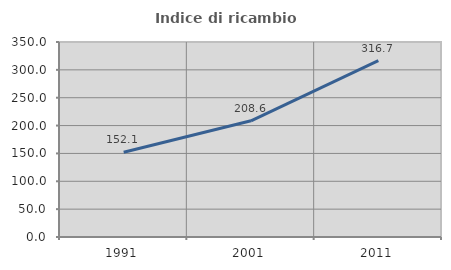
| Category | Indice di ricambio occupazionale  |
|---|---|
| 1991.0 | 152.091 |
| 2001.0 | 208.611 |
| 2011.0 | 316.667 |